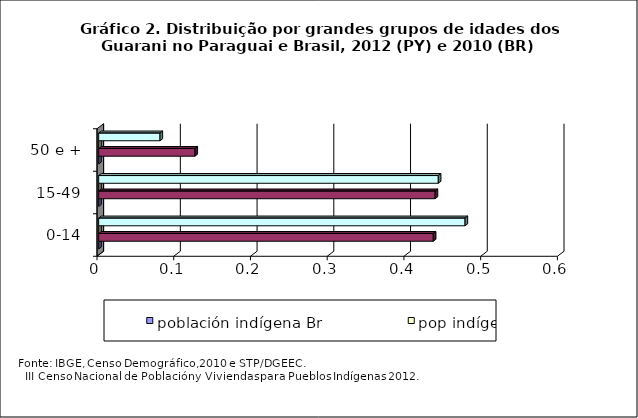
| Category | población indígena Br | Guarani Br | pop indígena Py | Guarani Py |
|---|---|---|---|---|
| 0-14 |  | 0.436 |  | 0.477 |
| 15-49 |  | 0.438 |  | 0.443 |
| 50 e + |  | 0.125 |  | 0.08 |